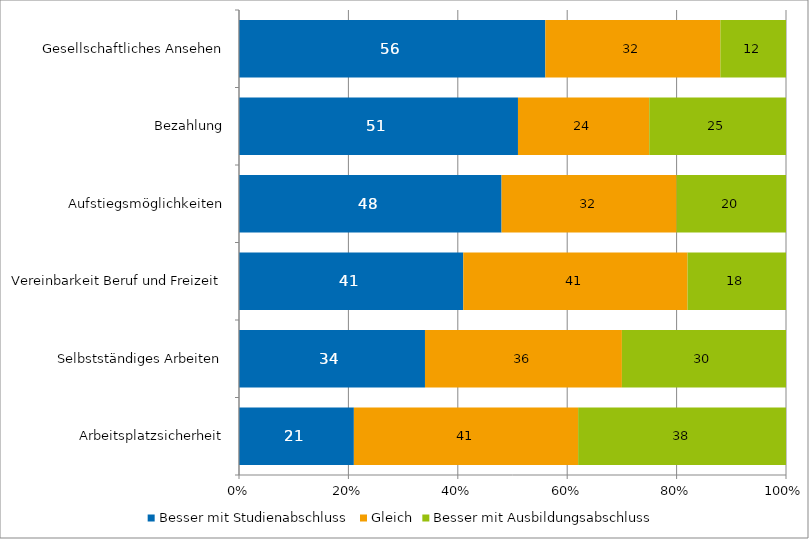
| Category | Besser mit Studienabschluss | Gleich | Besser mit Ausbildungsabschluss |
|---|---|---|---|
| Arbeitsplatzsicherheit | 0.21 | 0.41 | 0.38 |
| Selbstständiges Arbeiten | 0.34 | 0.36 | 0.3 |
| Vereinbarkeit Beruf und Freizeit | 0.41 | 0.41 | 0.18 |
| Aufstiegsmöglichkeiten | 0.48 | 0.32 | 0.2 |
| Bezahlung | 0.51 | 0.24 | 0.25 |
| Gesellschaftliches Ansehen | 0.56 | 0.32 | 0.12 |